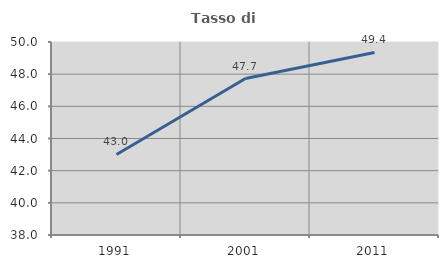
| Category | Tasso di occupazione   |
|---|---|
| 1991.0 | 43.008 |
| 2001.0 | 47.729 |
| 2011.0 | 49.352 |